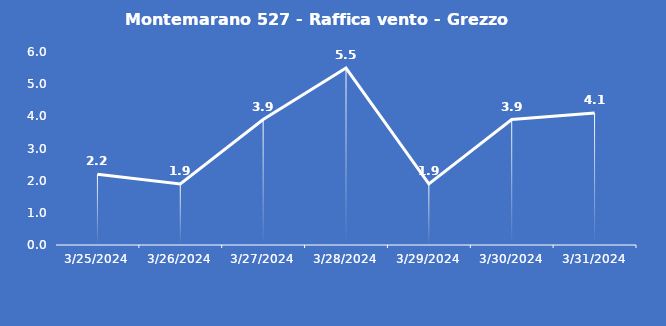
| Category | Montemarano 527 - Raffica vento - Grezzo (m/s) |
|---|---|
| 3/25/24 | 2.2 |
| 3/26/24 | 1.9 |
| 3/27/24 | 3.9 |
| 3/28/24 | 5.5 |
| 3/29/24 | 1.9 |
| 3/30/24 | 3.9 |
| 3/31/24 | 4.1 |